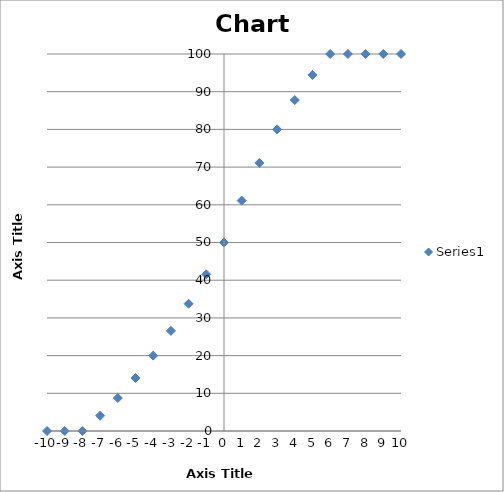
| Category | Series 0 |
|---|---|
| -10.0 | 0 |
| -9.0 | 0 |
| -8.0 | 0 |
| -7.0 | 4.062 |
| -6.0 | 8.75 |
| -5.0 | 14.062 |
| -4.0 | 20 |
| -3.0 | 26.562 |
| -2.0 | 33.75 |
| -1.0 | 41.562 |
| 0.0 | 50 |
| 1.0 | 61.111 |
| 2.0 | 71.112 |
| 3.0 | 80.001 |
| 4.0 | 87.779 |
| 5.0 | 94.446 |
| 6.0 | 100 |
| 7.0 | 100 |
| 8.0 | 100 |
| 9.0 | 100 |
| 10.0 | 100 |